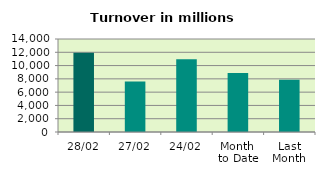
| Category | Series 0 |
|---|---|
| 28/02 | 11921.194 |
| 27/02 | 7594.014 |
| 24/02 | 10958.517 |
| Month 
to Date | 8884.685 |
| Last
Month | 7855.802 |